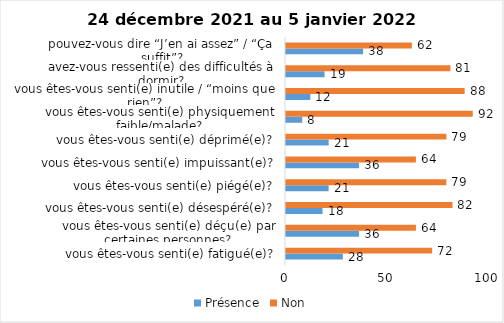
| Category | Présence | Non |
|---|---|---|
| vous êtes-vous senti(e) fatigué(e)? | 28 | 72 |
| vous êtes-vous senti(e) déçu(e) par certaines personnes? | 36 | 64 |
| vous êtes-vous senti(e) désespéré(e)? | 18 | 82 |
| vous êtes-vous senti(e) piégé(e)? | 21 | 79 |
| vous êtes-vous senti(e) impuissant(e)? | 36 | 64 |
| vous êtes-vous senti(e) déprimé(e)? | 21 | 79 |
| vous êtes-vous senti(e) physiquement faible/malade? | 8 | 92 |
| vous êtes-vous senti(e) inutile / “moins que rien”? | 12 | 88 |
| avez-vous ressenti(e) des difficultés à dormir? | 19 | 81 |
| pouvez-vous dire “J’en ai assez” / “Ça suffit”? | 38 | 62 |